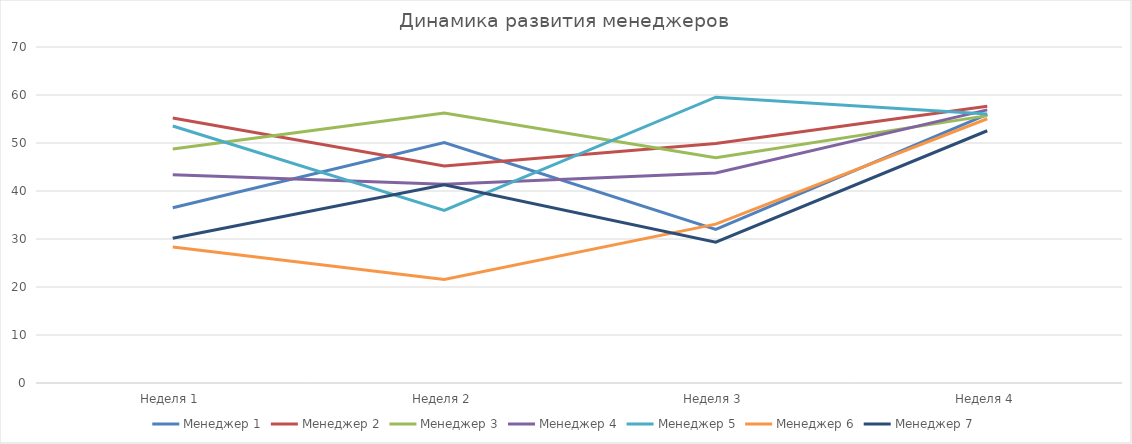
| Category | Менеджер 1 | Менеджер 2 | Менеджер 3 | Менеджер 4 | Менеджер 5 | Менеджер 6 | Менеджер 7 |
|---|---|---|---|---|---|---|---|
| Неделя 1 | 36.5 | 55.2 | 48.75 | 43.4 | 53.55 | 28.35 | 30.15 |
| Неделя 2 | 50.1 | 45.2 | 56.25 | 41.4 | 35.95 | 21.55 | 41.3 |
| Неделя 3 | 32 | 49.9 | 46.95 | 43.75 | 59.55 | 33.1 | 29.35 |
| Неделя 4 | 55.95 | 57.65 | 55.7 | 56.9 | 56.05 | 55.05 | 52.55 |